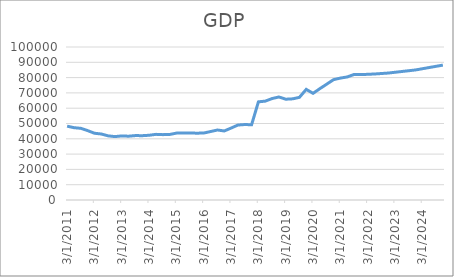
| Category | GDP |
|---|---|
| 3/31/11 |  |
| 6/30/11 |  |
| 9/30/11 |  |
| 12/31/11 |  |
| 3/31/12 |  |
| 6/30/12 |  |
| 9/30/12 |  |
| 12/31/12 |  |
| 3/31/13 |  |
| 6/30/13 |  |
| 9/30/13 |  |
| 12/31/13 |  |
| 3/31/14 |  |
| 6/30/14 |  |
| 9/30/14 |  |
| 12/31/14 |  |
| 3/31/15 |  |
| 6/30/15 |  |
| 9/30/15 |  |
| 12/31/15 |  |
| 3/31/16 |  |
| 6/30/16 |  |
| 9/30/16 |  |
| 12/31/16 |  |
| 3/31/17 |  |
| 6/30/17 |  |
| 9/30/17 |  |
| 12/31/17 |  |
| 3/31/18 |  |
| 6/30/18 |  |
| 9/30/18 |  |
| 12/31/18 |  |
| 3/31/19 |  |
| 6/30/19 |  |
| 9/30/19 |  |
| 12/31/19 |  |
| 3/31/20 |  |
| 6/30/20 |  |
| 9/30/20 |  |
| 12/31/20 |  |
| 3/31/21 |  |
| 6/30/21 |  |
| 9/30/21 |  |
| 12/31/21 |  |
| 3/31/22 |  |
| 6/30/22 |  |
| 9/30/22 |  |
| 12/31/22 |  |
| 3/31/23 |  |
| 6/30/23 |  |
| 9/30/23 |  |
| 12/31/23 |  |
| 3/31/24 |  |
| 6/30/24 |  |
| 9/30/24 |  |
| 12/31/24 |  |